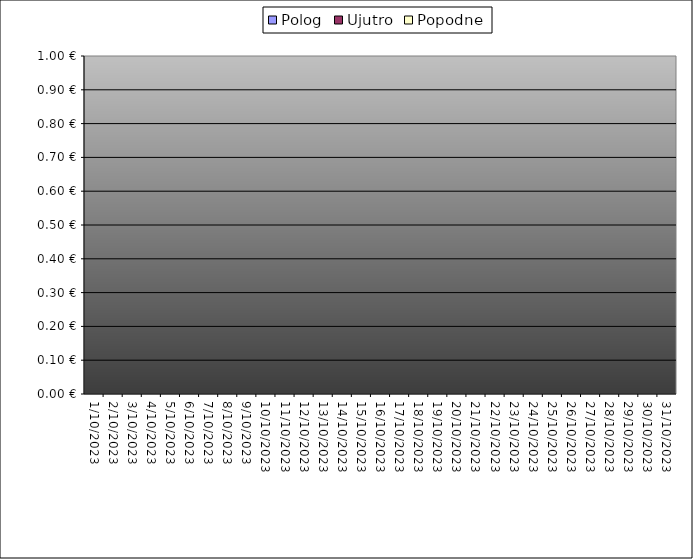
| Category | Polog | Ujutro | Popodne |
|---|---|---|---|
| 2023-10-01 |  | 0 | 0 |
| 2023-10-02 |  | 0 | 0 |
| 2023-10-03 |  | 0 | 0 |
| 2023-10-04 |  | 0 | 0 |
| 2023-10-05 |  | 0 | 0 |
| 2023-10-06 |  | 0 | 0 |
| 2023-10-07 |  | 0 | 0 |
| 2023-10-08 |  | 0 | 0 |
| 2023-10-09 |  | 0 | 0 |
| 2023-10-10 |  | 0 | 0 |
| 2023-10-11 |  | 0 | 0 |
| 2023-10-12 |  | 0 | 0 |
| 2023-10-13 |  | 0 | 0 |
| 2023-10-14 |  | 0 | 0 |
| 2023-10-15 |  | 0 | 0 |
| 2023-10-16 |  | 0 | 0 |
| 2023-10-17 |  | 0 | 0 |
| 2023-10-18 |  | 0 | 0 |
| 2023-10-19 |  | 0 | 0 |
| 2023-10-20 |  | 0 | 0 |
| 2023-10-21 |  | 0 | 0 |
| 2023-10-22 |  | 0 | 0 |
| 2023-10-23 |  | 0 | 0 |
| 2023-10-24 |  | 0 | 0 |
| 2023-10-25 |  | 0 | 0 |
| 2023-10-26 |  | 0 | 0 |
| 2023-10-27 |  | 0 | 0 |
| 2023-10-28 |  | 0 | 0 |
| 2023-10-29 |  | 0 | 0 |
| 2023-10-30 |  | 0 | 0 |
| 2023-10-31 |  | 0 | 0 |